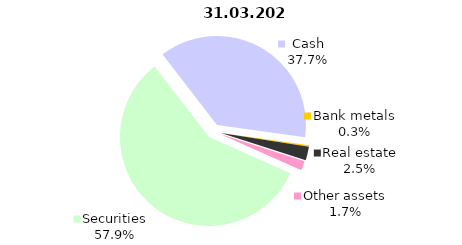
| Category | 31.03.2021 |
|---|---|
| Securities | 2106.2 |
| Cash | 1370.49 |
| Bank metals | 10.485 |
| Real estate | 90.355 |
| Other assets | 62.073 |